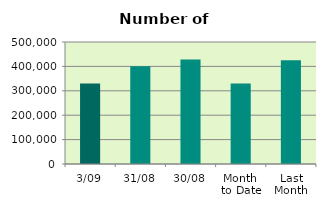
| Category | Series 0 |
|---|---|
| 3/09 | 329488 |
| 31/08 | 400470 |
| 30/08 | 428750 |
| Month 
to Date | 329488 |
| Last
Month | 425540 |